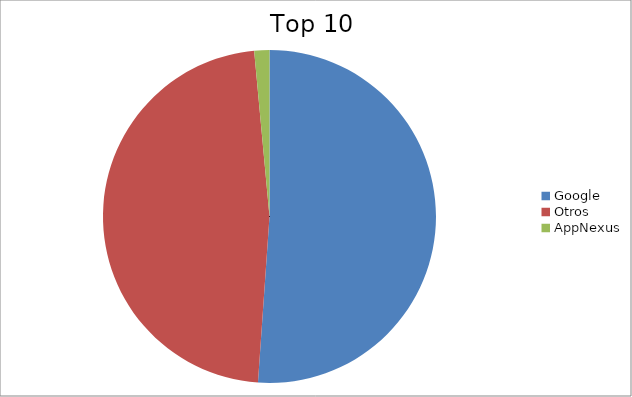
| Category | Series 0 |
|---|---|
| Google | 51.1 |
| Otros | 47.42 |
| AppNexus | 1.47 |